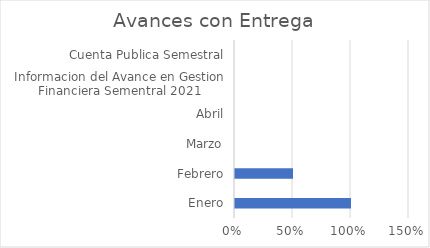
| Category | Series 0 |
|---|---|
| Enero | 1 |
| Febrero | 0.5 |
| Marzo | 0 |
| Abril | 0 |
| Informacion del Avance en Gestion Financiera Sementral 2021 | 0 |
| Cuenta Publica Semestral | 0 |